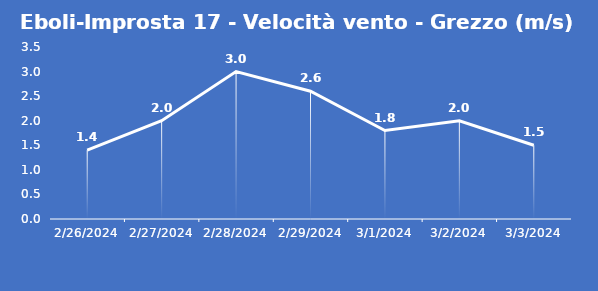
| Category | Eboli-Improsta 17 - Velocità vento - Grezzo (m/s) |
|---|---|
| 2/26/24 | 1.4 |
| 2/27/24 | 2 |
| 2/28/24 | 3 |
| 2/29/24 | 2.6 |
| 3/1/24 | 1.8 |
| 3/2/24 | 2 |
| 3/3/24 | 1.5 |